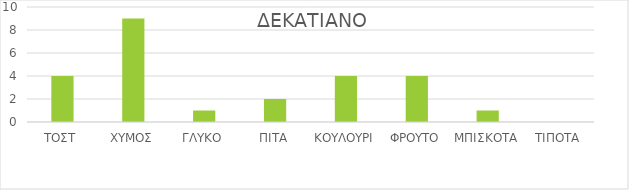
| Category | Series 0 |
|---|---|
| ΤΟΣΤ | 4 |
| ΧΥΜΟΣ | 9 |
| ΓΛΥΚΟ | 1 |
| ΠΙΤΑ | 2 |
| ΚΟΥΛΟΥΡΙ | 4 |
| ΦΡΟΥΤΟ | 4 |
| ΜΠΙΣΚΟΤΑ | 1 |
| ΤΙΠΟΤΑ | 0 |